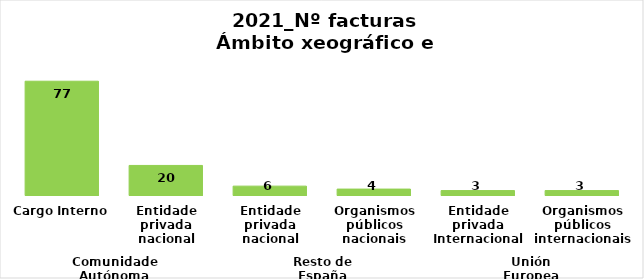
| Category | Series 0 |
|---|---|
| 0 | 77 |
| 1 | 20 |
| 2 | 6 |
| 3 | 4 |
| 4 | 3 |
| 5 | 3 |